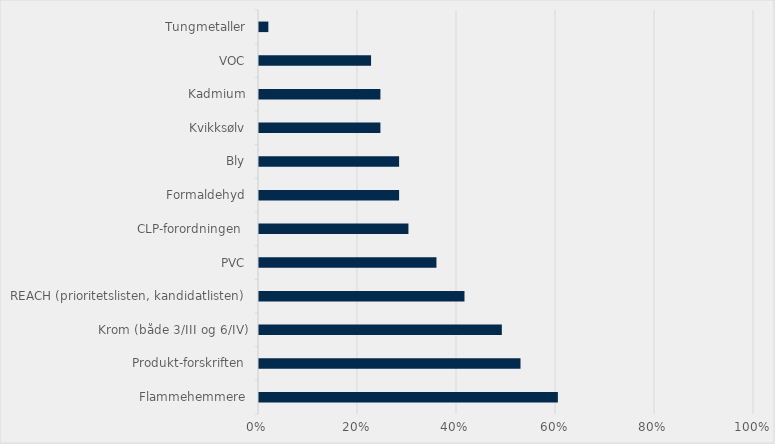
| Category | Prosentvis andel av anskaffelser som har stilt krav |
|---|---|
| Flammehemmere | 0.604 |
| Produkt-forskriften | 0.528 |
| Krom (både 3/III og 6/IV) | 0.491 |
| REACH (prioritetslisten, kandidatlisten) | 0.415 |
| PVC | 0.358 |
| CLP-forordningen  | 0.302 |
| Formaldehyd | 0.283 |
| Bly | 0.283 |
| Kvikksølv | 0.245 |
| Kadmium | 0.245 |
| VOC | 0.226 |
| Tungmetaller | 0.019 |